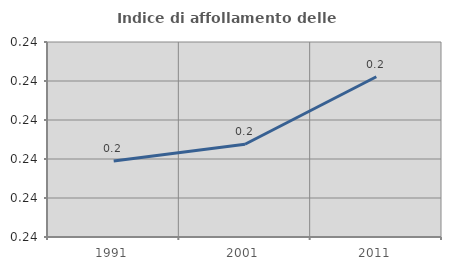
| Category | Indice di affollamento delle abitazioni  |
|---|---|
| 1991.0 | 0.239 |
| 2001.0 | 0.239 |
| 2011.0 | 0.241 |